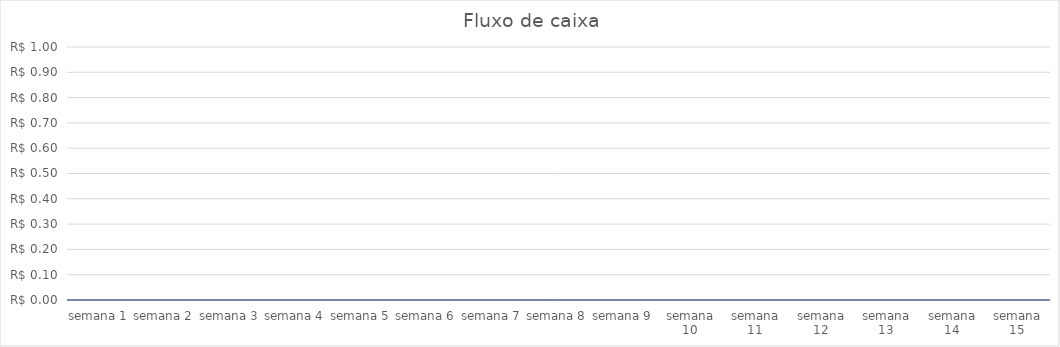
| Category | SALDO FLUXO DE CAIXA   |
|---|---|
| semana 1 | 0 |
| semana 2 | 0 |
| semana 3 | 0 |
| semana 4 | 0 |
| semana 5 | 0 |
| semana 6 | 0 |
| semana 7 | 0 |
| semana 8 | 0 |
| semana 9 | 0 |
| semana 10 | 0 |
| semana 11 | 0 |
| semana 12 | 0 |
| semana 13 | 0 |
| semana 14 | 0 |
| semana 15 | 0 |